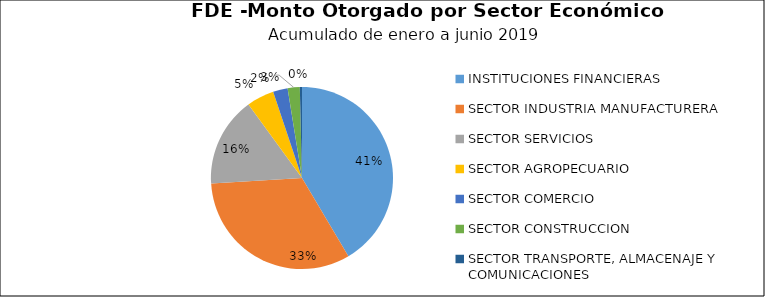
| Category | Monto | Créditos |
|---|---|---|
| INSTITUCIONES FINANCIERAS | 2.7 | 1 |
| SECTOR INDUSTRIA MANUFACTURERA | 2.119 | 70 |
| SECTOR SERVICIOS | 1.038 | 21 |
| SECTOR AGROPECUARIO | 0.318 | 13 |
| SECTOR COMERCIO | 0.169 | 29 |
| SECTOR CONSTRUCCION | 0.14 | 1 |
| SECTOR TRANSPORTE, ALMACENAJE Y COMUNICACIONES | 0.025 | 1 |